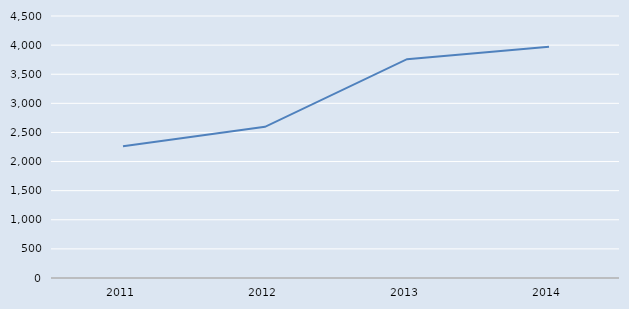
| Category | Series 0 |
|---|---|
| 2011.0 | 2264 |
| 2012.0 | 2597 |
| 2013.0 | 3759 |
| 2014.0 | 3971 |